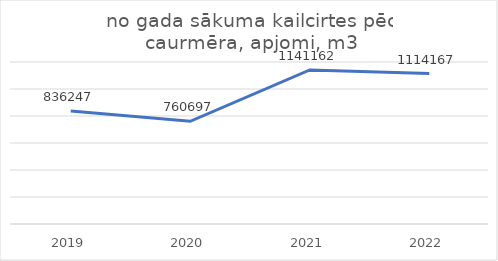
| Category | no gada sākuma kailcirtes pēc caurmēra, apjomi, m3 |
|---|---|
| 2019.0 | 836247 |
| 2020.0 | 760697 |
| 2021.0 | 1141162 |
| 2022.0 | 1114167 |